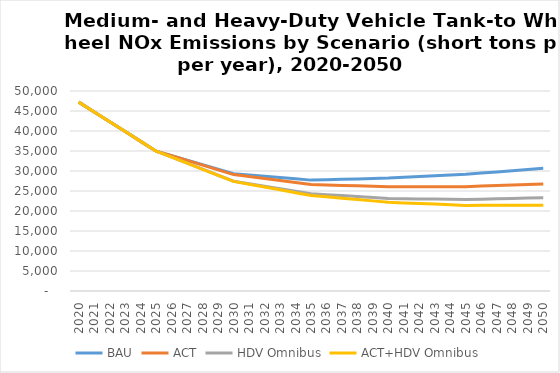
| Category | BAU | ACT | HDV Omnibus | ACT+HDV Omnibus |
|---|---|---|---|---|
| 2020.0 | 47220 | 47220 | 47220 | 47220 |
| 2021.0 | 44770 | 44770 | 44770 | 44770 |
| 2022.0 | 42320 | 42320 | 42320 | 42320 |
| 2023.0 | 39860 | 39860 | 39860 | 39860 |
| 2024.0 | 37410 | 37410 | 37410 | 37410 |
| 2025.0 | 34960 | 34960 | 34960 | 34960 |
| 2026.0 | 33830 | 33830 | 33460 | 33460 |
| 2027.0 | 32710 | 32650 | 31950 | 31950 |
| 2028.0 | 31580 | 31470 | 30450 | 30430 |
| 2029.0 | 30460 | 30280 | 28940 | 28920 |
| 2030.0 | 29330 | 29100 | 27440 | 27400 |
| 2031.0 | 29010 | 28600 | 26820 | 26700 |
| 2032.0 | 28690 | 28100 | 26200 | 25990 |
| 2033.0 | 28360 | 27600 | 25570 | 25290 |
| 2034.0 | 28040 | 27100 | 24950 | 24580 |
| 2035.0 | 27720 | 26600 | 24330 | 23880 |
| 2036.0 | 27820 | 26500 | 24090 | 23540 |
| 2037.0 | 27930 | 26400 | 23860 | 23200 |
| 2038.0 | 28030 | 26290 | 23620 | 22870 |
| 2039.0 | 28140 | 26190 | 23390 | 22530 |
| 2040.0 | 28240 | 26090 | 23150 | 22190 |
| 2041.0 | 28430 | 26090 | 23090 | 22030 |
| 2042.0 | 28620 | 26090 | 23030 | 21870 |
| 2043.0 | 28810 | 26090 | 22980 | 21720 |
| 2044.0 | 29000 | 26090 | 22920 | 21560 |
| 2045.0 | 29190 | 26090 | 22860 | 21400 |
| 2046.0 | 29480 | 26220 | 22950 | 21410 |
| 2047.0 | 29780 | 26360 | 23050 | 21420 |
| 2048.0 | 30070 | 26490 | 23140 | 21440 |
| 2049.0 | 30370 | 26630 | 23240 | 21450 |
| 2050.0 | 30660 | 26760 | 23330 | 21460 |